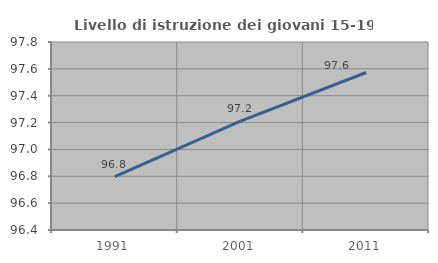
| Category | Livello di istruzione dei giovani 15-19 anni |
|---|---|
| 1991.0 | 96.798 |
| 2001.0 | 97.211 |
| 2011.0 | 97.573 |